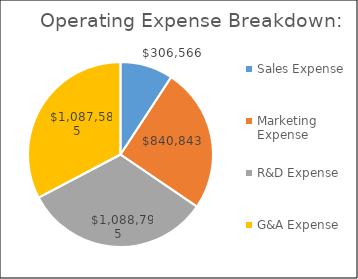
| Category | Series 1 |
|---|---|
| Sales Expense | 306565.625 |
| Marketing Expense | 840843.205 |
| R&D Expense | 1088795.212 |
| G&A Expense | 1087584.95 |